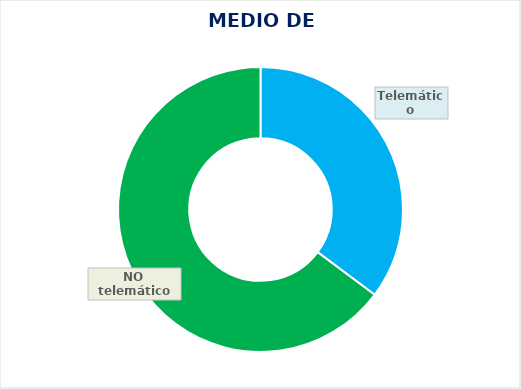
| Category | PORCENTAJE |
|---|---|
| Telemático | 0.352 |
| NO telemático | 0.648 |